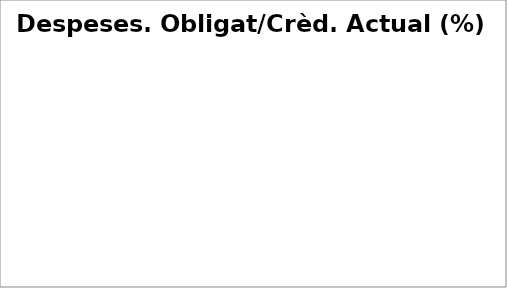
| Category | Series 0 |
|---|---|
| Despeses de personal | 0.211 |
| Despeses en béns corrents i serveis | 0.082 |
| Despeses financeres | 0.045 |
| Transferències corrents | 0.179 |
| Fons de contingència | 0 |
| Inversions reals | 0.038 |
| Transferències de capital | 0.008 |
| Actius financers | 0.265 |
| Passius financers | 0.682 |